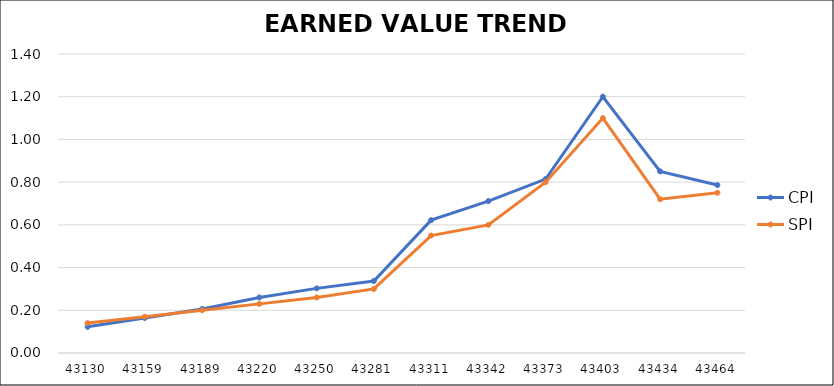
| Category | CPI | SPI |
|---|---|---|
| 2018-01-30 | 0.123 | 0.14 |
| 2018-02-28 | 0.164 | 0.17 |
| 2018-03-30 | 0.206 | 0.2 |
| 2018-04-30 | 0.26 | 0.23 |
| 2018-05-30 | 0.303 | 0.26 |
| 2018-06-30 | 0.337 | 0.3 |
| 2018-07-30 | 0.622 | 0.55 |
| 2018-08-30 | 0.711 | 0.6 |
| 2018-09-30 | 0.815 | 0.8 |
| 2018-10-30 | 1.2 | 1.1 |
| 2018-11-30 | 0.85 | 0.72 |
| 2018-12-30 | 0.786 | 0.75 |